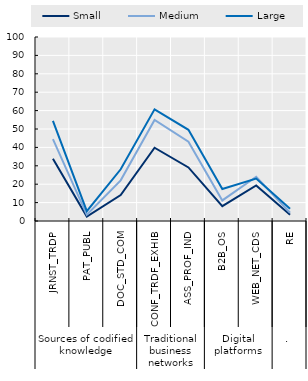
| Category | Small | Medium | Large |
|---|---|---|---|
| 0 | 33.841 | 44.529 | 54.465 |
| 1 | 2.412 | 3.367 | 5.313 |
| 2 | 14.106 | 22.094 | 28.118 |
| 3 | 39.812 | 54.929 | 60.676 |
| 4 | 29.125 | 43.062 | 49.544 |
| 5 | 8.035 | 11.176 | 17.388 |
| 6 | 19.347 | 24.065 | 23.029 |
| 7 | 3.429 | 4.475 | 6.694 |